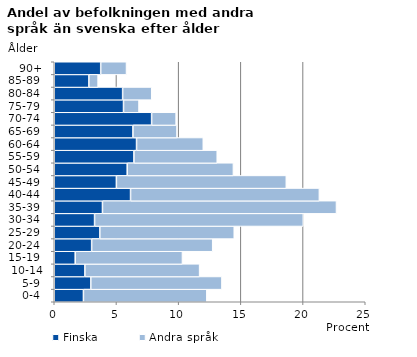
| Category | Finska | Andra språk |
|---|---|---|
|   0-4  | 2.346 | 9.92 |
|   5-9  | 2.938 | 10.541 |
| 10-14 | 2.463 | 9.221 |
| 15-19  | 1.685 | 8.62 |
| 20-24  | 3.006 | 9.731 |
| 25-29  | 3.663 | 10.806 |
| 30-34  | 3.241 | 16.78 |
| 35-39  | 3.876 | 18.811 |
| 40-44  | 6.134 | 15.177 |
| 45-49  | 4.995 | 13.66 |
| 50-54  | 5.866 | 8.536 |
| 55-59  | 6.405 | 6.696 |
| 60-64  | 6.615 | 5.365 |
| 65-69  | 6.326 | 3.543 |
| 70-74  | 7.827 | 1.97 |
| 75-79  | 5.568 | 1.245 |
| 80-84  | 5.497 | 2.339 |
| 85-89  | 2.783 | 0.742 |
| 90+ | 3.734 | 2.075 |